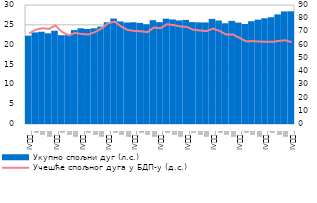
| Category | Укупно спољни дуг (л.с.) |
|---|---|
| IV
2009. | 22.272 |
| I | 23.09 |
| II | 23.254 |
| III | 22.861 |
| IV
2010. | 23.509 |
| I | 22.384 |
| II | 22.4 |
| III | 23.676 |
| IV
2011. | 24.123 |
| I | 23.947 |
| II | 24.124 |
| III | 24.565 |
| IV
2012. | 25.645 |
| I | 26.582 |
| II | 25.858 |
| III | 25.582 |
| IV
2013. | 25.644 |
| I | 25.497 |
| II | 25.144 |
| III | 26.171 |
| IV
2014. | 25.679 |
| I | 26.552 |
| II | 26.348 |
| III | 26.111 |
| IV
2015. | 26.234 |
| I | 25.682 |
| II | 25.621 |
| III | 25.603 |
| IV
2016. | 26.494 |
| I | 26.091 |
| II | 25.389 |
| III | 25.999 |
| IV
2017. | 25.578 |
| I | 25.216 |
| II | 25.906 |
| III | 26.312 |
| IV
2018. | 26.662 |
| I | 26.913 |
| II | 27.631 |
| III | 28.381 |
| IV
2019. | 28.418 |